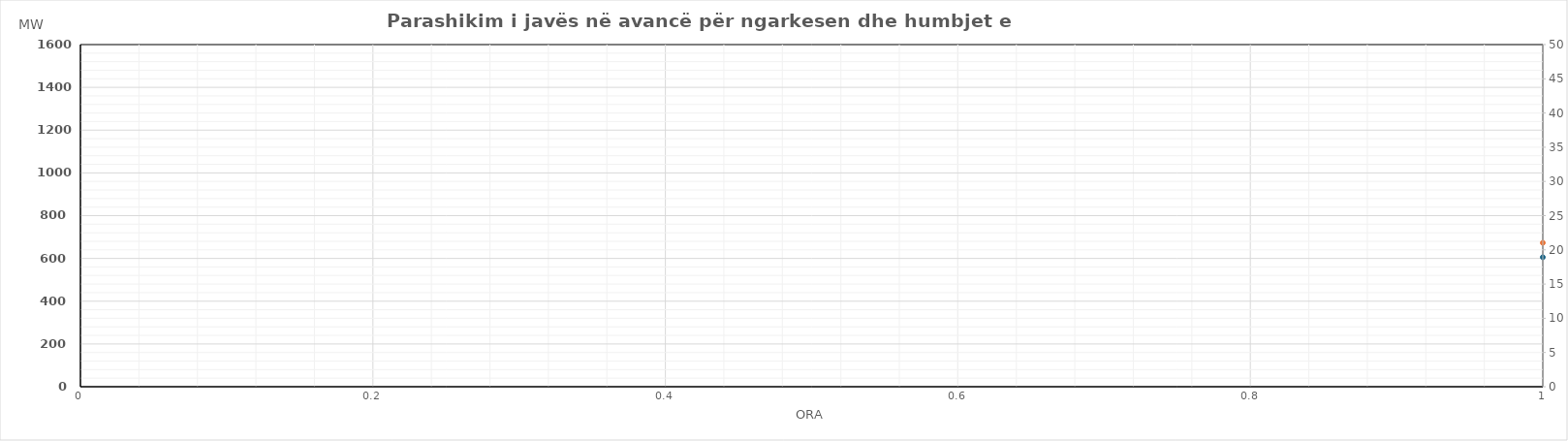
| Category | Ngarkesa (MWh) |
|---|---|
| 0 | 672.974 |
| 1 | 588.182 |
| 2 | 550.112 |
| 3 | 536.442 |
| 4 | 547.531 |
| 5 | 622.107 |
| 6 | 838.903 |
| 7 | 1126.257 |
| 8 | 1220.823 |
| 9 | 1201.719 |
| 10 | 1103.047 |
| 11 | 1042.54 |
| 12 | 1007.586 |
| 13 | 1013.733 |
| 14 | 1037.273 |
| 15 | 1057.835 |
| 16 | 1111.603 |
| 17 | 1283.98 |
| 18 | 1375.129 |
| 19 | 1378.358 |
| 20 | 1347.695 |
| 21 | 1228.438 |
| 22 | 1040.101 |
| 23 | 808.969 |
| 24 | 666.047 |
| 25 | 591.858 |
| 26 | 557.656 |
| 27 | 548.123 |
| 28 | 562.007 |
| 29 | 630.182 |
| 30 | 832.82 |
| 31 | 1125.003 |
| 32 | 1183.378 |
| 33 | 1119.347 |
| 34 | 1035.609 |
| 35 | 979.229 |
| 36 | 959.849 |
| 37 | 980.958 |
| 38 | 1024.225 |
| 39 | 1058.362 |
| 40 | 1115.496 |
| 41 | 1269.179 |
| 42 | 1344.214 |
| 43 | 1336.895 |
| 44 | 1311.699 |
| 45 | 1197.44 |
| 46 | 1032.819 |
| 47 | 850.233 |
| 48 | 705.749 |
| 49 | 599.233 |
| 50 | 546.928 |
| 51 | 531.288 |
| 52 | 538.23 |
| 53 | 606.588 |
| 54 | 793.212 |
| 55 | 1064.584 |
| 56 | 1144.291 |
| 57 | 1120.02 |
| 58 | 1062.769 |
| 59 | 1016.115 |
| 60 | 991.469 |
| 61 | 1017.761 |
| 62 | 1039.257 |
| 63 | 1041.998 |
| 64 | 1068.101 |
| 65 | 1236.812 |
| 66 | 1331.524 |
| 67 | 1324.994 |
| 68 | 1289.02 |
| 69 | 1171.658 |
| 70 | 986.522 |
| 71 | 786.984 |
| 72 | 639.632 |
| 73 | 563.822 |
| 74 | 533.219 |
| 75 | 521.719 |
| 76 | 533.183 |
| 77 | 604.616 |
| 78 | 793.206 |
| 79 | 1060.395 |
| 80 | 1133.145 |
| 81 | 1095.989 |
| 82 | 1026.652 |
| 83 | 1015.659 |
| 84 | 1013.428 |
| 85 | 1037.098 |
| 86 | 1048.291 |
| 87 | 1050.858 |
| 88 | 1057.485 |
| 89 | 1196.141 |
| 90 | 1292.71 |
| 91 | 1303.46 |
| 92 | 1272.244 |
| 93 | 1155.687 |
| 94 | 973.597 |
| 95 | 771.562 |
| 96 | 634.745 |
| 97 | 563.974 |
| 98 | 530.742 |
| 99 | 520.999 |
| 100 | 530.21 |
| 101 | 600.555 |
| 102 | 781.565 |
| 103 | 1030.07 |
| 104 | 1103.488 |
| 105 | 1059.507 |
| 106 | 993.604 |
| 107 | 946.56 |
| 108 | 932.224 |
| 109 | 942.647 |
| 110 | 955.651 |
| 111 | 973.903 |
| 112 | 1029.538 |
| 113 | 1174.169 |
| 114 | 1236.251 |
| 115 | 1224.919 |
| 116 | 1187.253 |
| 117 | 1081.356 |
| 118 | 925.533 |
| 119 | 749.424 |
| 120 | 622.148 |
| 121 | 550.798 |
| 122 | 515.284 |
| 123 | 505.762 |
| 124 | 514.692 |
| 125 | 572.476 |
| 126 | 708.403 |
| 127 | 892.622 |
| 128 | 1036.552 |
| 129 | 1077.228 |
| 130 | 1081.241 |
| 131 | 1047.977 |
| 132 | 1062.563 |
| 133 | 1071.564 |
| 134 | 1083.648 |
| 135 | 1067.235 |
| 136 | 1080.328 |
| 137 | 1161.455 |
| 138 | 1193.747 |
| 139 | 1169.799 |
| 140 | 1124.698 |
| 141 | 1008.995 |
| 142 | 867.891 |
| 143 | 737.486 |
| 144 | 622.919 |
| 145 | 541.45 |
| 146 | 482.094 |
| 147 | 453.334 |
| 148 | 459.004 |
| 149 | 488.218 |
| 150 | 564.433 |
| 151 | 695.157 |
| 152 | 835.563 |
| 153 | 931.953 |
| 154 | 975.807 |
| 155 | 999.407 |
| 156 | 1003.414 |
| 157 | 992.063 |
| 158 | 967.331 |
| 159 | 971.828 |
| 160 | 1003.876 |
| 161 | 1104.662 |
| 162 | 1160.903 |
| 163 | 1162.181 |
| 164 | 1142.445 |
| 165 | 1041.966 |
| 166 | 882.111 |
| 167 | 711.871 |